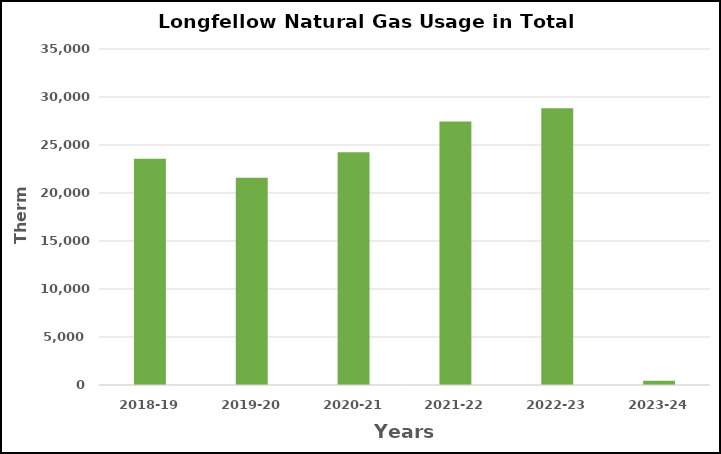
| Category | Series 0 |
|---|---|
| 2018-19 | 23561 |
| 2019-20 | 21582 |
| 2020-21 | 24238 |
| 2021-22 | 27445 |
| 2022-23 | 28825 |
| 2023-24 | 444 |